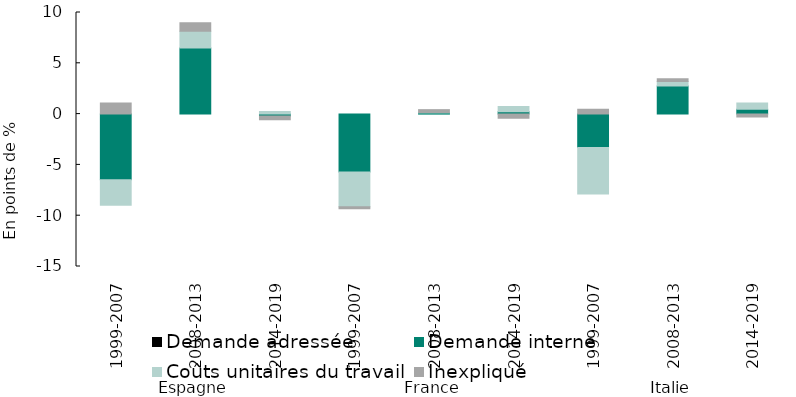
| Category | Demande adressée | Demande interne | Coûts unitaires du travail | Inexpliqué |
|---|---|---|---|---|
| 0 | 0 | -6.472 | -2.503 | 1.088 |
| 1 | 0 | 6.51 | 1.653 | 0.816 |
| 2 | 0 | -0.182 | 0.251 | -0.368 |
| 3 | 0 | -5.687 | -3.435 | -0.203 |
| 4 | 0 | 0.116 | 0.043 | 0.28 |
| 5 | 0 | 0.242 | 0.511 | -0.405 |
| 6 | 0 | -3.276 | -4.586 | 0.476 |
| 7 | 0 | 2.778 | 0.435 | 0.268 |
| 8 | 0 | 0.472 | 0.624 | -0.29 |